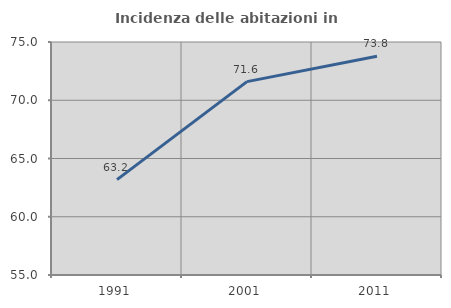
| Category | Incidenza delle abitazioni in proprietà  |
|---|---|
| 1991.0 | 63.191 |
| 2001.0 | 71.597 |
| 2011.0 | 73.78 |